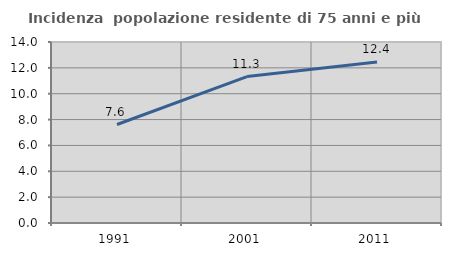
| Category | Incidenza  popolazione residente di 75 anni e più |
|---|---|
| 1991.0 | 7.618 |
| 2001.0 | 11.324 |
| 2011.0 | 12.444 |